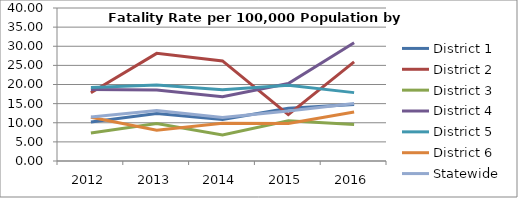
| Category | District 1 | District 2 | District 3 | District 4 | District 5 | District 6 | Statewide |
|---|---|---|---|---|---|---|---|
| 2012.0 | 10.211 | 17.84 | 7.321 | 18.699 | 19.191 | 11.454 | 11.531 |
| 2013.0 | 12.411 | 28.146 | 9.828 | 18.532 | 19.863 | 8.074 | 13.212 |
| 2014.0 | 10.84 | 26.16 | 6.784 | 16.798 | 18.649 | 9.894 | 11.38 |
| 2015.0 | 13.777 | 12.106 | 10.539 | 20.271 | 19.828 | 9.808 | 13.052 |
| 2016.0 | 14.778 | 25.909 | 9.542 | 30.936 | 17.877 | 12.832 | 15.031 |